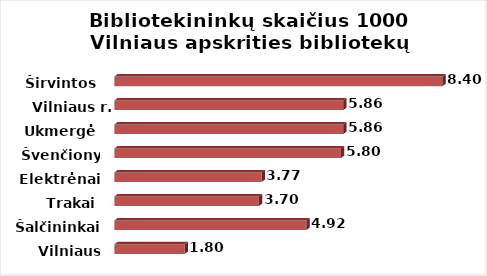
| Category | Series 0 |
|---|---|
| Vilniaus m. | 1.8 |
| Šalčininkai | 4.92 |
| Trakai | 3.7 |
| Elektrėnai | 3.77 |
| Švenčionys | 5.8 |
| Ukmergė | 5.86 |
| Vilniaus r. | 5.86 |
| Širvintos | 8.4 |